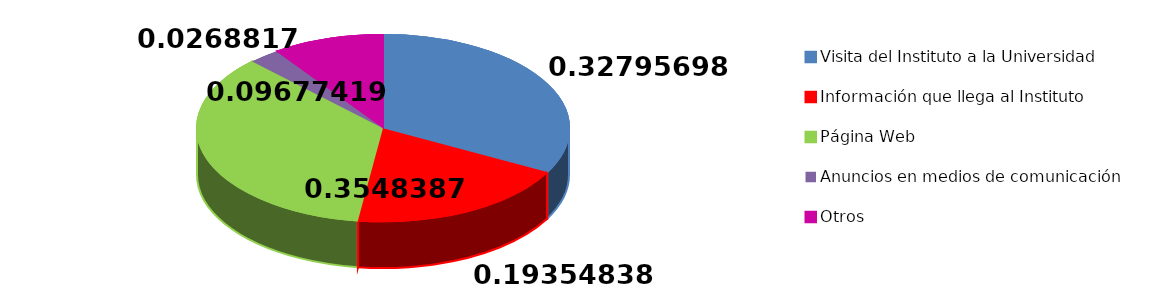
| Category | Series 0 |
|---|---|
| Visita del Instituto a la Universidad | 61 |
| Información que llega al Instituto | 36 |
| Página Web | 66 |
| Anuncios en medios de comunicación | 5 |
| Otros | 18 |